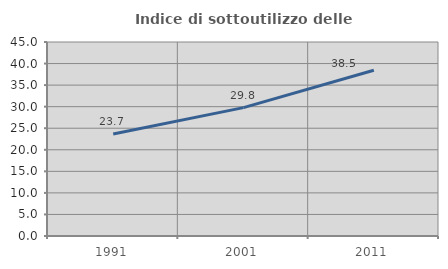
| Category | Indice di sottoutilizzo delle abitazioni  |
|---|---|
| 1991.0 | 23.667 |
| 2001.0 | 29.776 |
| 2011.0 | 38.462 |